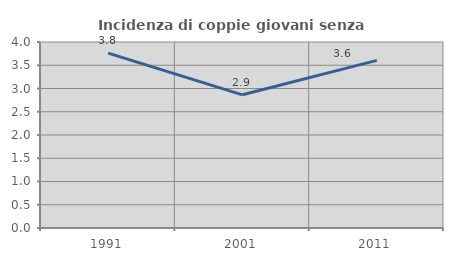
| Category | Incidenza di coppie giovani senza figli |
|---|---|
| 1991.0 | 3.759 |
| 2001.0 | 2.864 |
| 2011.0 | 3.605 |